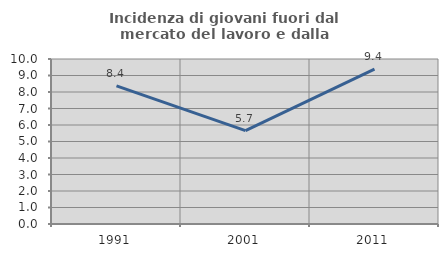
| Category | Incidenza di giovani fuori dal mercato del lavoro e dalla formazione  |
|---|---|
| 1991.0 | 8.37 |
| 2001.0 | 5.66 |
| 2011.0 | 9.392 |